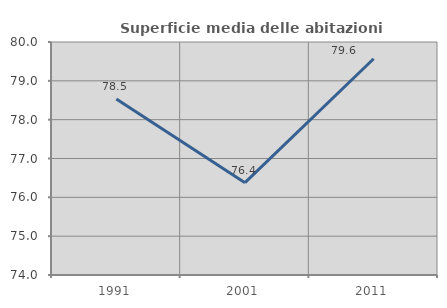
| Category | Superficie media delle abitazioni occupate |
|---|---|
| 1991.0 | 78.53 |
| 2001.0 | 76.378 |
| 2011.0 | 79.568 |